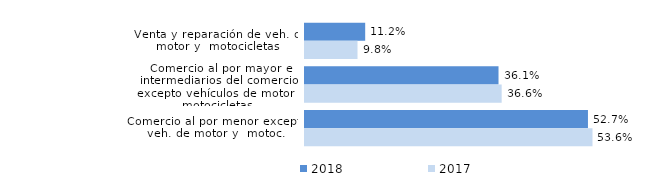
| Category | 2018 | 2017 |
|---|---|---|
| Venta y reparación de veh. de motor y  motocicletas | 0.112 | 0.098 |
| Comercio al por mayor e intermediarios del comercio, excepto vehículos de motor y motocicletas | 0.361 | 0.366 |
| Comercio al por menor excepto veh. de motor y  motoc. | 0.527 | 0.536 |